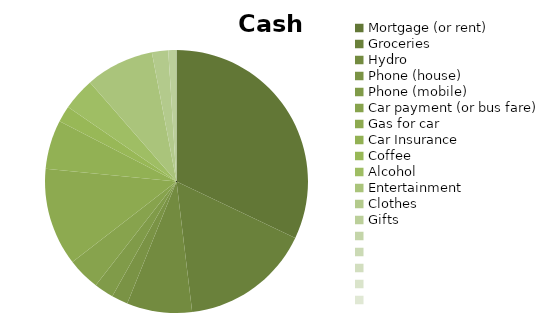
| Category | Amount |
|---|---|
| Mortgage (or rent) | 800 |
| Groceries | 400 |
| Hydro | 200 |
| Phone (house) | 50 |
| Phone (mobile) | 60 |
| Car payment (or bus fare) | 100 |
| Gas for car | 300 |
| Car Insurance | 150 |
| Coffee | 50 |
| Alcohol | 100 |
| Entertainment | 210 |
| Clothes | 50 |
| Gifts | 25 |